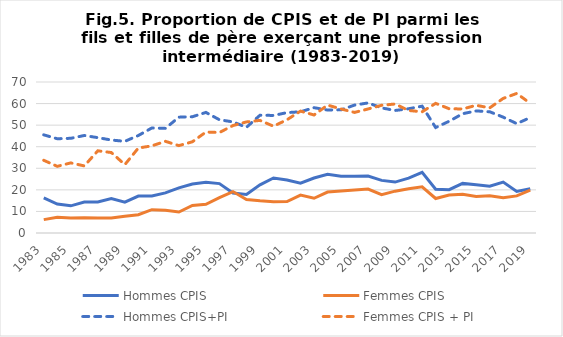
| Category | Hommes CPIS | Femmes CPIS | Hommes CPIS+PI | Femmes CPIS + PI |
|---|---|---|---|---|
| 1983.0 | 16.3 | 6.2 | 45.5 | 33.7 |
| 1984.0 | 13.4 | 7.3 | 43.7 | 30.9 |
| 1985.0 | 12.6 | 7 | 43.9 | 32.5 |
| 1986.0 | 14.4 | 7.1 | 45.2 | 31.1 |
| 1987.0 | 14.4 | 6.9 | 44.2 | 38.1 |
| 1988.0 | 16 | 7 | 43.1 | 37.3 |
| 1989.0 | 14.3 | 7.8 | 42.5 | 31.7 |
| 1990.0 | 17.1 | 8.5 | 45.2 | 39.4 |
| 1991.0 | 17.2 | 10.8 | 48.7 | 40.4 |
| 1992.0 | 18.6 | 10.5 | 48.5 | 42.5 |
| 1993.0 | 20.9 | 9.7 | 53.7 | 40.5 |
| 1994.0 | 22.7 | 12.8 | 53.9 | 42.3 |
| 1995.0 | 23.5 | 13.3 | 55.9 | 46.8 |
| 1996.0 | 22.9 | 16.4 | 52.5 | 46.6 |
| 1997.0 | 18.5 | 19.2 | 51.5 | 49.8 |
| 1998.0 | 17.9 | 15.5 | 49 | 51.5 |
| 1999.0 | 22.3 | 14.9 | 54.6 | 52.2 |
| 2000.0 | 25.5 | 14.5 | 54.5 | 49.5 |
| 2001.0 | 24.6 | 14.6 | 55.8 | 52.5 |
| 2002.0 | 23.1 | 17.6 | 56.2 | 56.5 |
| 2003.0 | 25.5 | 16.1 | 58.1 | 54.7 |
| 2004.0 | 27.2 | 19 | 57 | 59.3 |
| 2005.0 | 26.3 | 19.5 | 57.1 | 57.5 |
| 2006.0 | 26.3 | 19.9 | 59.3 | 55.9 |
| 2007.0 | 26.4 | 20.4 | 60.3 | 57.5 |
| 2008.0 | 24.4 | 17.8 | 58 | 59.2 |
| 2009.0 | 23.6 | 19.4 | 56.8 | 59.8 |
| 2010.0 | 25.4 | 20.5 | 57.6 | 56.8 |
| 2011.0 | 28.1 | 21.4 | 58.8 | 56.2 |
| 2012.0 | 20.3 | 16 | 48.9 | 60.1 |
| 2013.0 | 20.1 | 17.6 | 51.8 | 57.6 |
| 2014.0 | 23 | 18 | 55.3 | 57.5 |
| 2015.0 | 22.4 | 16.9 | 56.6 | 59.2 |
| 2016.0 | 21.7 | 17.3 | 56.2 | 58 |
| 2017.0 | 23.6 | 16.4 | 53.7 | 62.4 |
| 2018.0 | 19.3 | 17.2 | 50.7 | 64.7 |
| 2019.0 | 20.5 | 19.9 | 53.5 | 60.1 |